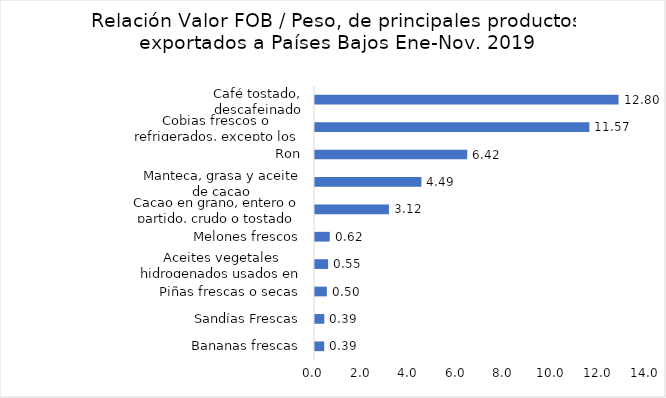
| Category | Series 0 |
|---|---|
| Bananas frescas | 0.389 |
| Sandías Frescas | 0.392 |
| Piñas frescas o secas | 0.5 |
| Aceites vegetales hidrogenados usados en la industria alimenticia. | 0.553 |
| Melones frescos | 0.621 |
| Cacao en grano, entero o partido, crudo o tostado | 3.119 |
| Manteca, grasa y aceite de cacao | 4.487 |
| Ron | 6.42 |
| Cobias frescos o refrigerados, excepto los hígados, huevas y lechas. | 11.571 |
| Café tostado, descafeinado | 12.8 |